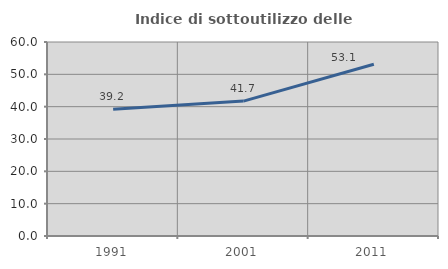
| Category | Indice di sottoutilizzo delle abitazioni  |
|---|---|
| 1991.0 | 39.2 |
| 2001.0 | 41.727 |
| 2011.0 | 53.103 |